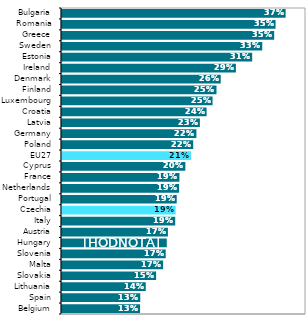
| Category | Series 0 |
|---|---|
| Belgium | 0.128 |
| Spain | 0.128 |
| Lithuania | 0.137 |
| Slovakia | 0.154 |
| Malta | 0.166 |
| Slovenia | 0.17 |
| Hungary | 0.172 |
| Austria | 0.174 |
| Italy | 0.186 |
| Czechia | 0.186 |
| Portugal | 0.188 |
| Netherlands | 0.192 |
| France | 0.193 |
| Cyprus | 0.202 |
| EU27 | 0.212 |
| Poland | 0.215 |
| Germany | 0.22 |
| Latvia | 0.226 |
| Croatia | 0.237 |
| Luxembourg | 0.247 |
| Finland | 0.253 |
| Denmark | 0.26 |
| Ireland | 0.285 |
| Estonia | 0.312 |
| Sweden | 0.328 |
| Greece | 0.348 |
| Romania | 0.35 |
| Bulgaria | 0.367 |